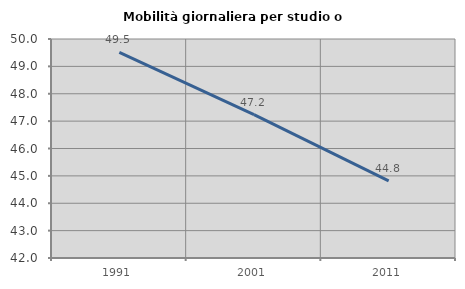
| Category | Mobilità giornaliera per studio o lavoro |
|---|---|
| 1991.0 | 49.512 |
| 2001.0 | 47.239 |
| 2011.0 | 44.817 |